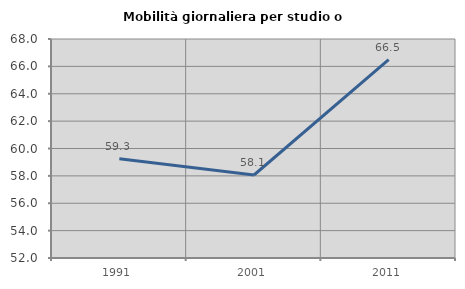
| Category | Mobilità giornaliera per studio o lavoro |
|---|---|
| 1991.0 | 59.259 |
| 2001.0 | 58.065 |
| 2011.0 | 66.497 |